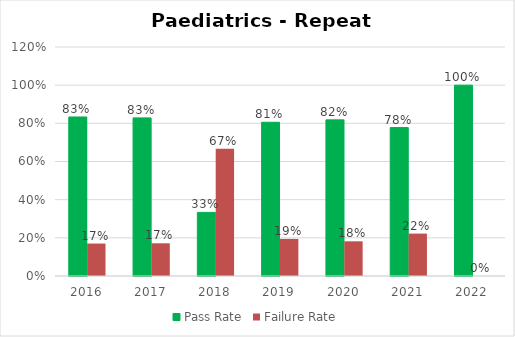
| Category | Pass Rate | Failure Rate |
|---|---|---|
| 2016.0 | 0.833 | 0.17 |
| 2017.0 | 0.829 | 0.171 |
| 2018.0 | 0.333 | 0.667 |
| 2019.0 | 0.806 | 0.194 |
| 2020.0 | 0.818 | 0.182 |
| 2021.0 | 0.778 | 0.222 |
| 2022.0 | 1 | 0 |